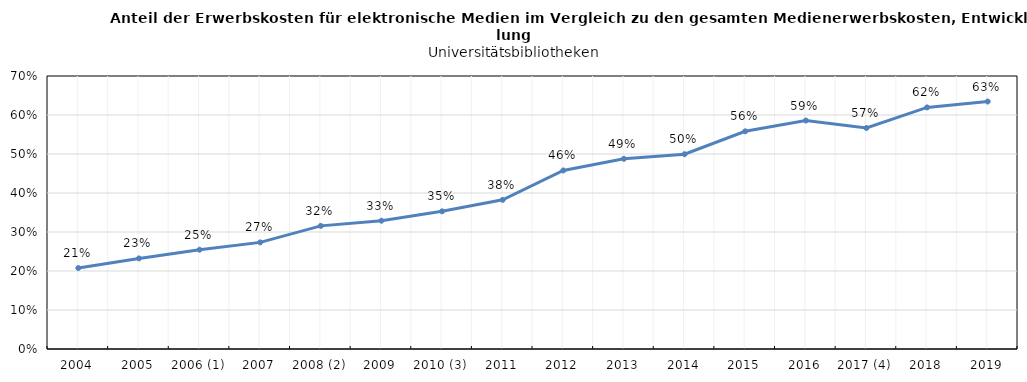
| Category | Series 0 |
|---|---|
| 2004 | 0.208 |
| 2005 | 0.232 |
| 2006 (1) | 0.255 |
| 2007 | 0.273 |
| 2008 (2) | 0.316 |
| 2009 | 0.329 |
| 2010 (3) | 0.353 |
| 2011 | 0.382 |
| 2012 | 0.458 |
| 2013 | 0.488 |
| 2014 | 0.499 |
| 2015 | 0.558 |
| 2016 | 0.586 |
| 2017 (4) | 0.567 |
| 2018 | 0.619 |
| 2019 | 0.635 |